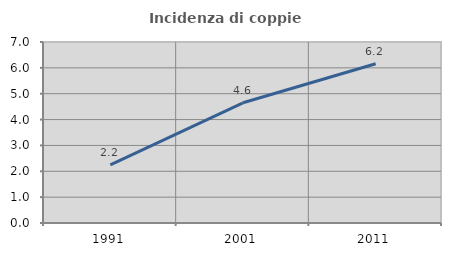
| Category | Incidenza di coppie miste |
|---|---|
| 1991.0 | 2.245 |
| 2001.0 | 4.649 |
| 2011.0 | 6.158 |